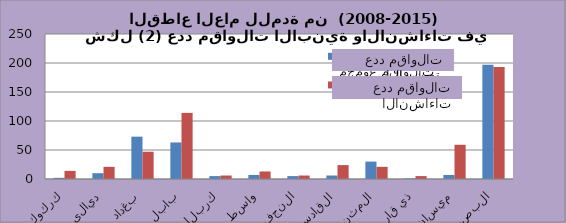
| Category | مجموع مقاولات الأبنية | مجموع مقاولات الإنشاءات |
|---|---|---|
| كركوك | 2 | 14 |
| ديالى | 10 | 21 |
| بغداد | 73 | 47 |
| بابل | 63 | 114 |
| كربلاء | 5 | 6 |
| واسط | 7 | 13 |
| النجف | 5 | 6 |
| القادسية | 6 | 24 |
| المثنى | 30 | 21 |
| ذي قار | 1 | 5 |
| ميسان | 7 | 59 |
| البصرة | 197 | 193 |